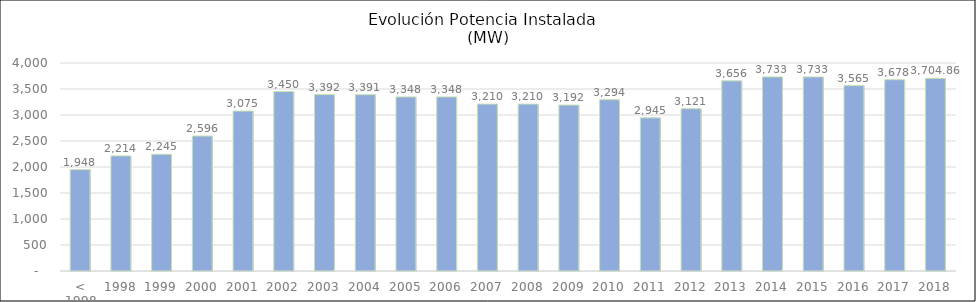
| Category | MW |
|---|---|
| < 1998 | 1947.762 |
| 1998 | 2213.812 |
| 1999 | 2244.612 |
| 2000 | 2596.172 |
| 2001 | 3075.106 |
| 2002 | 3450.406 |
| 2003 | 3392.306 |
| 2004 | 3390.806 |
| 2005 | 3348.006 |
| 2006 | 3348.006 |
| 2007 | 3210.006 |
| 2008 | 3210.006 |
| 2009 | 3191.706 |
| 2010 | 3294.356 |
| 2011 | 2945.356 |
| 2012 | 3121.324 |
| 2013 | 3656.324 |
| 2014 | 3733 |
| 2015 | 3733 |
| 2016 | 3564.7 |
| 2017 | 3678.2 |
| 2018 | 3704.86 |